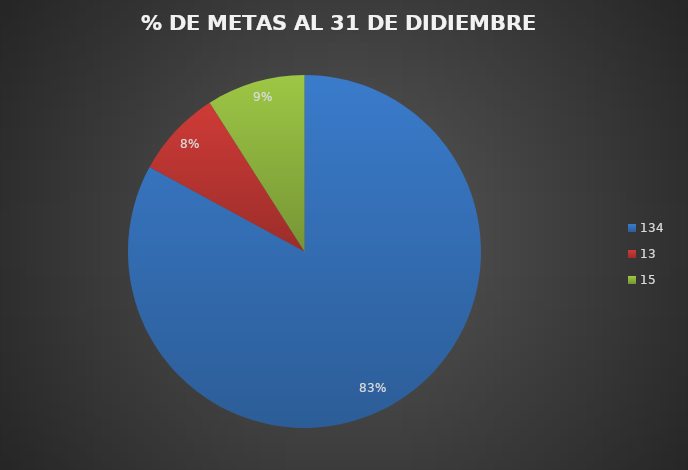
| Category | Series 0 |
|---|---|
| 134.0 | 0.827 |
| 13.0 | 0.08 |
| 15.0 | 0.09 |